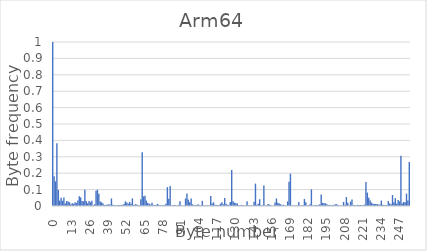
| Category | Series 0 |
|---|---|
| 0.0 | 1 |
| 1.0 | 0.181 |
| 2.0 | 0.15 |
| 3.0 | 0.383 |
| 4.0 | 0.097 |
| 5.0 | 0.033 |
| 6.0 | 0.05 |
| 7.0 | 0.032 |
| 8.0 | 0.052 |
| 9.0 | 0.015 |
| 10.0 | 0.03 |
| 11.0 | 0.027 |
| 12.0 | 0.023 |
| 13.0 | 0.011 |
| 14.0 | 0.017 |
| 15.0 | 0.013 |
| 16.0 | 0.022 |
| 17.0 | 0.018 |
| 18.0 | 0.033 |
| 19.0 | 0.06 |
| 20.0 | 0.052 |
| 21.0 | 0.03 |
| 22.0 | 0.029 |
| 23.0 | 0.099 |
| 24.0 | 0.03 |
| 25.0 | 0.017 |
| 26.0 | 0.03 |
| 27.0 | 0.023 |
| 28.0 | 0.031 |
| 29.0 | 0.005 |
| 30.0 | 0.011 |
| 31.0 | 0.093 |
| 32.0 | 0.099 |
| 33.0 | 0.075 |
| 34.0 | 0.028 |
| 35.0 | 0.022 |
| 36.0 | 0.016 |
| 37.0 | 0.006 |
| 38.0 | 0.008 |
| 39.0 | 0.008 |
| 40.0 | 0.01 |
| 41.0 | 0.009 |
| 42.0 | 0.046 |
| 43.0 | 0.008 |
| 44.0 | 0.006 |
| 45.0 | 0.004 |
| 46.0 | 0.005 |
| 47.0 | 0.006 |
| 48.0 | 0.006 |
| 49.0 | 0.006 |
| 50.0 | 0.007 |
| 51.0 | 0.013 |
| 52.0 | 0.028 |
| 53.0 | 0.022 |
| 54.0 | 0.014 |
| 55.0 | 0.024 |
| 56.0 | 0.014 |
| 57.0 | 0.047 |
| 58.0 | 0.006 |
| 59.0 | 0.01 |
| 60.0 | 0.009 |
| 61.0 | 0.006 |
| 62.0 | 0.004 |
| 63.0 | 0.041 |
| 64.0 | 0.328 |
| 65.0 | 0.059 |
| 66.0 | 0.062 |
| 67.0 | 0.033 |
| 68.0 | 0.019 |
| 69.0 | 0.013 |
| 70.0 | 0.009 |
| 71.0 | 0.02 |
| 72.0 | 0.007 |
| 73.0 | 0.005 |
| 74.0 | 0.008 |
| 75.0 | 0.013 |
| 76.0 | 0.006 |
| 77.0 | 0.004 |
| 78.0 | 0.005 |
| 79.0 | 0.006 |
| 80.0 | 0.005 |
| 81.0 | 0.013 |
| 82.0 | 0.115 |
| 83.0 | 0.044 |
| 84.0 | 0.122 |
| 85.0 | 0.004 |
| 86.0 | 0.005 |
| 87.0 | 0.006 |
| 88.0 | 0.005 |
| 89.0 | 0.003 |
| 90.0 | 0.007 |
| 91.0 | 0.029 |
| 92.0 | 0.004 |
| 93.0 | 0.002 |
| 94.0 | 0.003 |
| 95.0 | 0.046 |
| 96.0 | 0.076 |
| 97.0 | 0.039 |
| 98.0 | 0.022 |
| 99.0 | 0.045 |
| 100.0 | 0.01 |
| 101.0 | 0.005 |
| 102.0 | 0.005 |
| 103.0 | 0.006 |
| 104.0 | 0.01 |
| 105.0 | 0.004 |
| 106.0 | 0.006 |
| 107.0 | 0.031 |
| 108.0 | 0.004 |
| 109.0 | 0.003 |
| 110.0 | 0.004 |
| 111.0 | 0.005 |
| 112.0 | 0.004 |
| 113.0 | 0.061 |
| 114.0 | 0.015 |
| 115.0 | 0.023 |
| 116.0 | 0.008 |
| 117.0 | 0.006 |
| 118.0 | 0.006 |
| 119.0 | 0.006 |
| 120.0 | 0.015 |
| 121.0 | 0.022 |
| 122.0 | 0.01 |
| 123.0 | 0.048 |
| 124.0 | 0.014 |
| 125.0 | 0.007 |
| 126.0 | 0.008 |
| 127.0 | 0.024 |
| 128.0 | 0.219 |
| 129.0 | 0.03 |
| 130.0 | 0.02 |
| 131.0 | 0.016 |
| 132.0 | 0.016 |
| 133.0 | 0.005 |
| 134.0 | 0.005 |
| 135.0 | 0.006 |
| 136.0 | 0.007 |
| 137.0 | 0.003 |
| 138.0 | 0.005 |
| 139.0 | 0.029 |
| 140.0 | 0.004 |
| 141.0 | 0.003 |
| 142.0 | 0.003 |
| 143.0 | 0.004 |
| 144.0 | 0.026 |
| 145.0 | 0.136 |
| 146.0 | 0.008 |
| 147.0 | 0.013 |
| 148.0 | 0.041 |
| 149.0 | 0.004 |
| 150.0 | 0.004 |
| 151.0 | 0.126 |
| 152.0 | 0.004 |
| 153.0 | 0.003 |
| 154.0 | 0.013 |
| 155.0 | 0.009 |
| 156.0 | 0.005 |
| 157.0 | 0.002 |
| 158.0 | 0.003 |
| 159.0 | 0.021 |
| 160.0 | 0.046 |
| 161.0 | 0.02 |
| 162.0 | 0.015 |
| 163.0 | 0.011 |
| 164.0 | 0.007 |
| 165.0 | 0.008 |
| 166.0 | 0.004 |
| 167.0 | 0.004 |
| 168.0 | 0.028 |
| 169.0 | 0.148 |
| 170.0 | 0.197 |
| 171.0 | 0.004 |
| 172.0 | 0.004 |
| 173.0 | 0.003 |
| 174.0 | 0.002 |
| 175.0 | 0.004 |
| 176.0 | 0.025 |
| 177.0 | 0.003 |
| 178.0 | 0.004 |
| 179.0 | 0.006 |
| 180.0 | 0.042 |
| 181.0 | 0.023 |
| 182.0 | 0.004 |
| 183.0 | 0.005 |
| 184.0 | 0.011 |
| 185.0 | 0.102 |
| 186.0 | 0.004 |
| 187.0 | 0.004 |
| 188.0 | 0.006 |
| 189.0 | 0.006 |
| 190.0 | 0.006 |
| 191.0 | 0.011 |
| 192.0 | 0.07 |
| 193.0 | 0.019 |
| 194.0 | 0.016 |
| 195.0 | 0.016 |
| 196.0 | 0.011 |
| 197.0 | 0.006 |
| 198.0 | 0.007 |
| 199.0 | 0.004 |
| 200.0 | 0.007 |
| 201.0 | 0.004 |
| 202.0 | 0.01 |
| 203.0 | 0.011 |
| 204.0 | 0.006 |
| 205.0 | 0.003 |
| 206.0 | 0.003 |
| 207.0 | 0.004 |
| 208.0 | 0.025 |
| 209.0 | 0.008 |
| 210.0 | 0.054 |
| 211.0 | 0.019 |
| 212.0 | 0.005 |
| 213.0 | 0.026 |
| 214.0 | 0.04 |
| 215.0 | 0.004 |
| 216.0 | 0.006 |
| 217.0 | 0.003 |
| 218.0 | 0.007 |
| 219.0 | 0.005 |
| 220.0 | 0.006 |
| 221.0 | 0.004 |
| 222.0 | 0.004 |
| 223.0 | 0.009 |
| 224.0 | 0.146 |
| 225.0 | 0.082 |
| 226.0 | 0.05 |
| 227.0 | 0.034 |
| 228.0 | 0.021 |
| 229.0 | 0.014 |
| 230.0 | 0.013 |
| 231.0 | 0.011 |
| 232.0 | 0.011 |
| 233.0 | 0.009 |
| 234.0 | 0.01 |
| 235.0 | 0.033 |
| 236.0 | 0.007 |
| 237.0 | 0.005 |
| 238.0 | 0.005 |
| 239.0 | 0.006 |
| 240.0 | 0.03 |
| 241.0 | 0.015 |
| 242.0 | 0.011 |
| 243.0 | 0.067 |
| 244.0 | 0.023 |
| 245.0 | 0.048 |
| 246.0 | 0.014 |
| 247.0 | 0.036 |
| 248.0 | 0.028 |
| 249.0 | 0.306 |
| 250.0 | 0.015 |
| 251.0 | 0.024 |
| 252.0 | 0.023 |
| 253.0 | 0.075 |
| 254.0 | 0.034 |
| 255.0 | 0.268 |